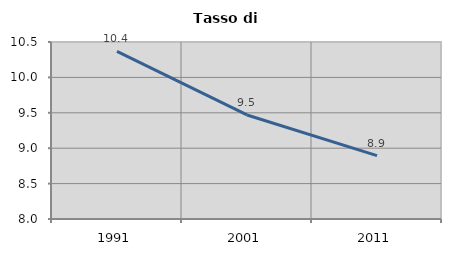
| Category | Tasso di disoccupazione   |
|---|---|
| 1991.0 | 10.367 |
| 2001.0 | 9.47 |
| 2011.0 | 8.896 |